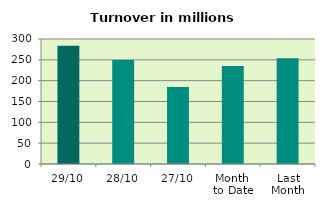
| Category | Series 0 |
|---|---|
| 29/10 | 284.052 |
| 28/10 | 249.477 |
| 27/10 | 184.557 |
| Month 
to Date | 235.36 |
| Last
Month | 253.961 |